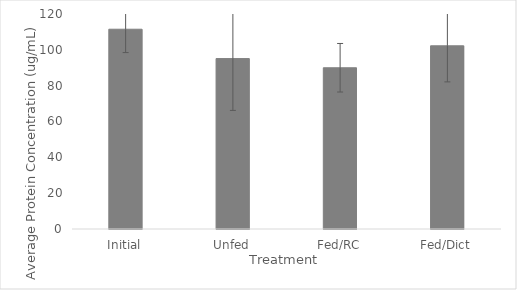
| Category | Series 0 |
|---|---|
| Initial | 111.5 |
| Unfed | 95.125 |
| Fed/RC | 90 |
| Fed/Dict | 102.25 |